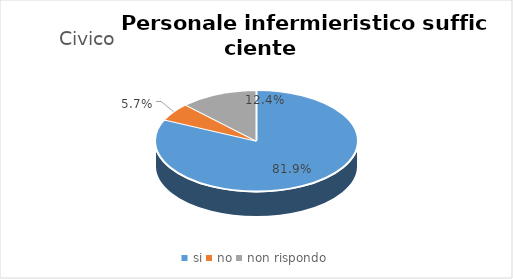
| Category | Civico - Osp -  Palermo - PA |
|---|---|
| si | 0.819 |
| no | 0.057 |
| non rispondo | 0.124 |